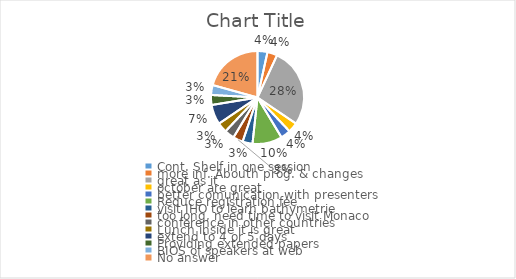
| Category | Series 0 |
|---|---|
| Cont. Shelf in one session | 1 |
| more inf. Abouth prog. & changes | 1 |
| great as it | 8 |
| october are great | 1 |
| better comunication with presenters | 1 |
| Reduce registration fee | 3 |
| visit IHO to learn bathymetrie | 1 |
| too long, need time to visit Monaco | 1 |
| conference in other countries | 1 |
| Lunch inside it is great | 1 |
| extend to 4 or 5 days | 2 |
| Providing extended papers | 1 |
| BIOS of speakers at web | 1 |
| No answer | 6 |